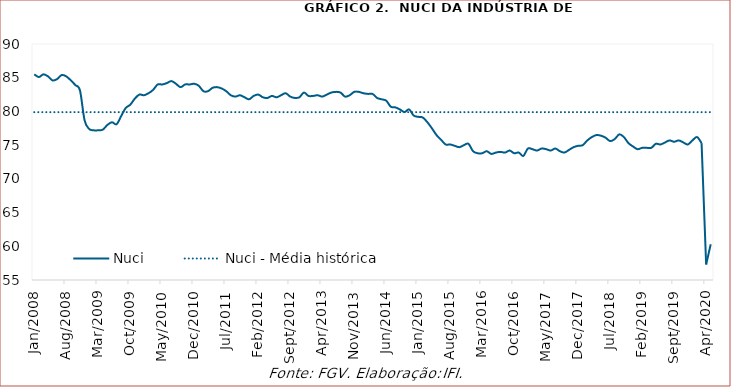
| Category | Nuci | Nuci - Média histórica |
|---|---|---|
| 2008-01-01 | 85.5 | 79.892 |
| 2008-02-01 | 85.1 | 79.892 |
| 2008-03-01 | 85.5 | 79.892 |
| 2008-04-01 | 85.2 | 79.892 |
| 2008-05-01 | 84.6 | 79.892 |
| 2008-06-01 | 84.8 | 79.892 |
| 2008-07-01 | 85.4 | 79.892 |
| 2008-08-01 | 85.2 | 79.892 |
| 2008-09-01 | 84.6 | 79.892 |
| 2008-10-01 | 83.9 | 79.892 |
| 2008-11-01 | 83.1 | 79.892 |
| 2008-12-01 | 78.7 | 79.892 |
| 2009-01-01 | 77.4 | 79.892 |
| 2009-02-01 | 77.2 | 79.892 |
| 2009-03-01 | 77.2 | 79.892 |
| 2009-04-01 | 77.3 | 79.892 |
| 2009-05-01 | 78 | 79.892 |
| 2009-06-01 | 78.4 | 79.892 |
| 2009-07-01 | 78.1 | 79.892 |
| 2009-08-01 | 79.3 | 79.892 |
| 2009-09-01 | 80.5 | 79.892 |
| 2009-10-01 | 81 | 79.892 |
| 2009-11-01 | 81.9 | 79.892 |
| 2009-12-01 | 82.5 | 79.892 |
| 2010-01-01 | 82.4 | 79.892 |
| 2010-02-01 | 82.7 | 79.892 |
| 2010-03-01 | 83.2 | 79.892 |
| 2010-04-01 | 84 | 79.892 |
| 2010-05-01 | 84 | 79.892 |
| 2010-06-01 | 84.2 | 79.892 |
| 2010-07-01 | 84.5 | 79.892 |
| 2010-08-01 | 84.1 | 79.892 |
| 2010-09-01 | 83.6 | 79.892 |
| 2010-10-01 | 84 | 79.892 |
| 2010-11-01 | 84 | 79.892 |
| 2010-12-01 | 84.1 | 79.892 |
| 2011-01-01 | 83.8 | 79.892 |
| 2011-02-01 | 83 | 79.892 |
| 2011-03-01 | 83 | 79.892 |
| 2011-04-01 | 83.5 | 79.892 |
| 2011-05-01 | 83.6 | 79.892 |
| 2011-06-01 | 83.4 | 79.892 |
| 2011-07-01 | 83 | 79.892 |
| 2011-08-01 | 82.4 | 79.892 |
| 2011-09-01 | 82.2 | 79.892 |
| 2011-10-01 | 82.4 | 79.892 |
| 2011-11-01 | 82.1 | 79.892 |
| 2011-12-01 | 81.8 | 79.892 |
| 2012-01-01 | 82.3 | 79.892 |
| 2012-02-01 | 82.5 | 79.892 |
| 2012-03-01 | 82.1 | 79.892 |
| 2012-04-01 | 82 | 79.892 |
| 2012-05-01 | 82.3 | 79.892 |
| 2012-06-01 | 82.1 | 79.892 |
| 2012-07-01 | 82.4 | 79.892 |
| 2012-08-01 | 82.7 | 79.892 |
| 2012-09-01 | 82.2 | 79.892 |
| 2012-10-01 | 82 | 79.892 |
| 2012-11-01 | 82.1 | 79.892 |
| 2012-12-01 | 82.8 | 79.892 |
| 2013-01-01 | 82.3 | 79.892 |
| 2013-02-01 | 82.3 | 79.892 |
| 2013-03-01 | 82.4 | 79.892 |
| 2013-04-01 | 82.2 | 79.892 |
| 2013-05-01 | 82.5 | 79.892 |
| 2013-06-01 | 82.8 | 79.892 |
| 2013-07-01 | 82.9 | 79.892 |
| 2013-08-01 | 82.8 | 79.892 |
| 2013-09-01 | 82.2 | 79.892 |
| 2013-10-01 | 82.4 | 79.892 |
| 2013-11-01 | 82.9 | 79.892 |
| 2013-12-01 | 82.9 | 79.892 |
| 2014-01-01 | 82.7 | 79.892 |
| 2014-02-01 | 82.6 | 79.892 |
| 2014-03-01 | 82.6 | 79.892 |
| 2014-04-01 | 82 | 79.892 |
| 2014-05-01 | 81.8 | 79.892 |
| 2014-06-01 | 81.6 | 79.892 |
| 2014-07-01 | 80.7 | 79.892 |
| 2014-08-01 | 80.6 | 79.892 |
| 2014-09-01 | 80.3 | 79.892 |
| 2014-10-01 | 79.9 | 79.892 |
| 2014-11-01 | 80.3 | 79.892 |
| 2014-12-01 | 79.4 | 79.892 |
| 2015-01-01 | 79.2 | 79.892 |
| 2015-02-01 | 79.1 | 79.892 |
| 2015-03-01 | 78.4 | 79.892 |
| 2015-04-01 | 77.5 | 79.892 |
| 2015-05-01 | 76.5 | 79.892 |
| 2015-06-01 | 75.8 | 79.892 |
| 2015-07-01 | 75.1 | 79.892 |
| 2015-08-01 | 75.1 | 79.892 |
| 2015-09-01 | 74.9 | 79.892 |
| 2015-10-01 | 74.7 | 79.892 |
| 2015-11-01 | 75 | 79.892 |
| 2015-12-01 | 75.2 | 79.892 |
| 2016-01-01 | 74.1 | 79.892 |
| 2016-02-01 | 73.8 | 79.892 |
| 2016-03-01 | 73.8 | 79.892 |
| 2016-04-01 | 74.1 | 79.892 |
| 2016-05-01 | 73.7 | 79.892 |
| 2016-06-01 | 73.9 | 79.892 |
| 2016-07-01 | 74 | 79.892 |
| 2016-08-01 | 73.9 | 79.892 |
| 2016-09-01 | 74.2 | 79.892 |
| 2016-10-01 | 73.8 | 79.892 |
| 2016-11-01 | 73.9 | 79.892 |
| 2016-12-01 | 73.4 | 79.892 |
| 2017-01-01 | 74.5 | 79.892 |
| 2017-02-01 | 74.4 | 79.892 |
| 2017-03-01 | 74.2 | 79.892 |
| 2017-04-01 | 74.5 | 79.892 |
| 2017-05-01 | 74.4 | 79.892 |
| 2017-06-01 | 74.2 | 79.892 |
| 2017-07-01 | 74.5 | 79.892 |
| 2017-08-01 | 74.1 | 79.892 |
| 2017-09-01 | 73.9 | 79.892 |
| 2017-10-01 | 74.3 | 79.892 |
| 2017-11-01 | 74.7 | 79.892 |
| 2017-12-01 | 74.9 | 79.892 |
| 2018-01-01 | 75 | 79.892 |
| 2018-02-01 | 75.7 | 79.892 |
| 2018-03-01 | 76.2 | 79.892 |
| 2018-04-01 | 76.5 | 79.892 |
| 2018-05-01 | 76.4 | 79.892 |
| 2018-06-01 | 76.1 | 79.892 |
| 2018-07-01 | 75.6 | 79.892 |
| 2018-08-01 | 75.9 | 79.892 |
| 2018-09-01 | 76.6 | 79.892 |
| 2018-10-01 | 76.2 | 79.892 |
| 2018-11-01 | 75.3 | 79.892 |
| 2018-12-01 | 74.8 | 79.892 |
| 2019-01-01 | 74.4 | 79.892 |
| 2019-02-01 | 74.6 | 79.892 |
| 2019-03-01 | 74.6 | 79.892 |
| 2019-04-01 | 74.6 | 79.892 |
| 2019-05-01 | 75.2 | 79.892 |
| 2019-06-01 | 75.1 | 79.892 |
| 2019-07-01 | 75.4 | 79.892 |
| 2019-08-01 | 75.7 | 79.892 |
| 2019-09-01 | 75.5 | 79.892 |
| 2019-10-01 | 75.7 | 79.892 |
| 2019-11-01 | 75.4 | 79.892 |
| 2019-12-01 | 75.1 | 79.892 |
| 2020-01-01 | 75.7 | 79.892 |
| 2020-02-01 | 76.2 | 79.892 |
| 2020-03-01 | 75.3 | 79.892 |
| 2020-04-01 | 57.3 | 79.892 |
| 2020-05-01 | 60.3 | 79.892 |